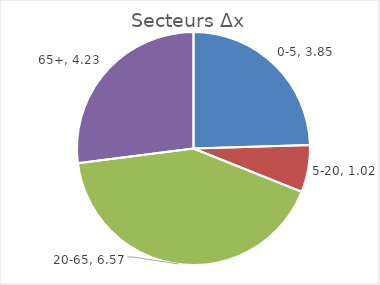
| Category | Secteurs |
|---|---|
| 0-5 | 3.847 |
| 5-20 | 1.023 |
| 20-65 | 6.575 |
| 65+ | 4.235 |